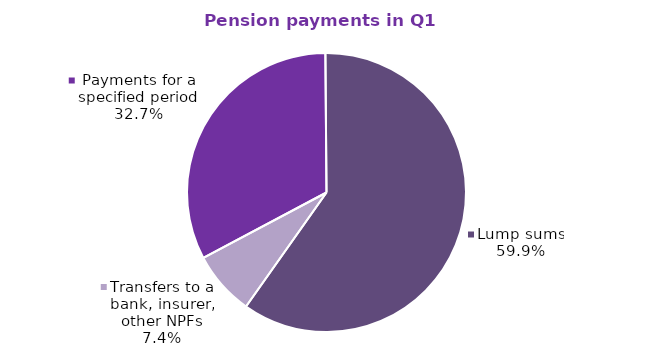
| Category | Series 0 |
|---|---|
| Payments for a specified period | 5534681.34 |
| Lump sums | 10155549.28 |
| Transfers to a bank, insurer, other NPFs | 1260945.42 |